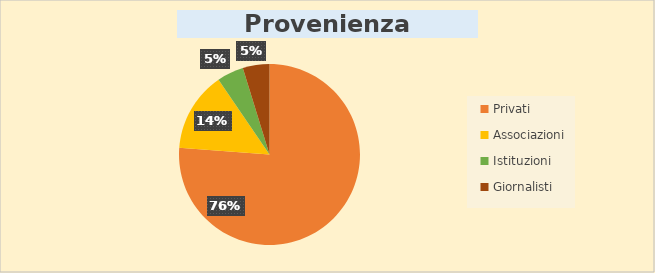
| Category | Series 0 |
|---|---|
| Privati | 16 |
| Associazioni | 3 |
| Istituzioni | 1 |
| Giornalisti | 1 |